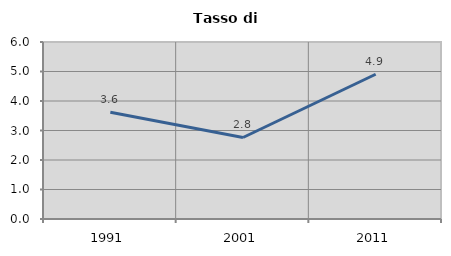
| Category | Tasso di disoccupazione   |
|---|---|
| 1991.0 | 3.618 |
| 2001.0 | 2.763 |
| 2011.0 | 4.907 |